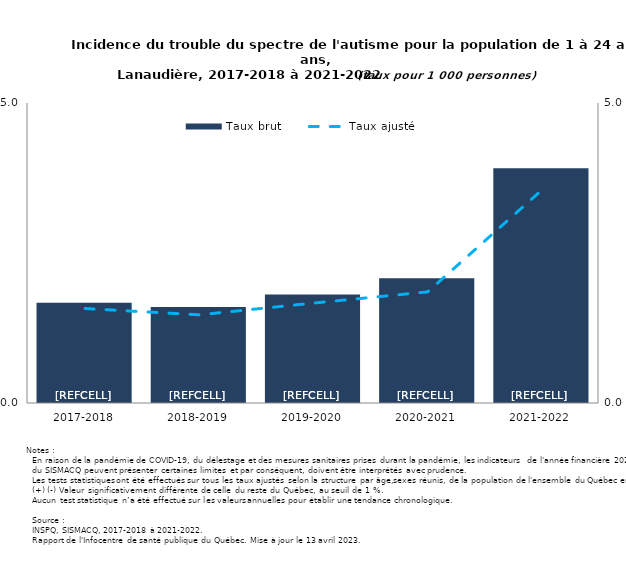
| Category | Taux brut |
|---|---|
| 2017-2018 | 1.672 |
| 2018-2019 | 1.6 |
| 2019-2020 | 1.81 |
| 2020-2021 | 2.078 |
| 2021-2022 | 3.914 |